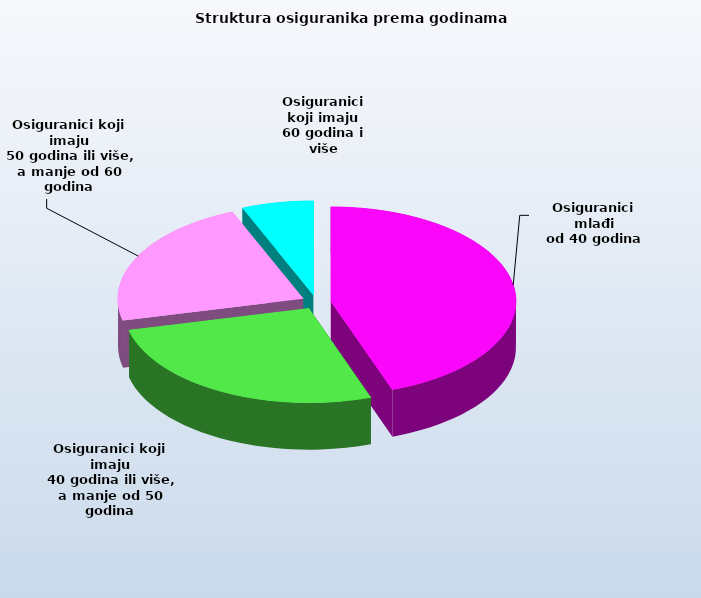
| Category | Series 0 |
|---|---|
| Osiguranici mlađi
od 40 godina | 689059 |
| Osiguranici koji imaju
 40 godina ili više, a manje od 50 godina | 412378 |
| Osiguranici koji imaju
 50 godina ili više, a manje od 60 godina | 347186 |
| Osiguranici koji imaju
60 godina i više | 96569 |